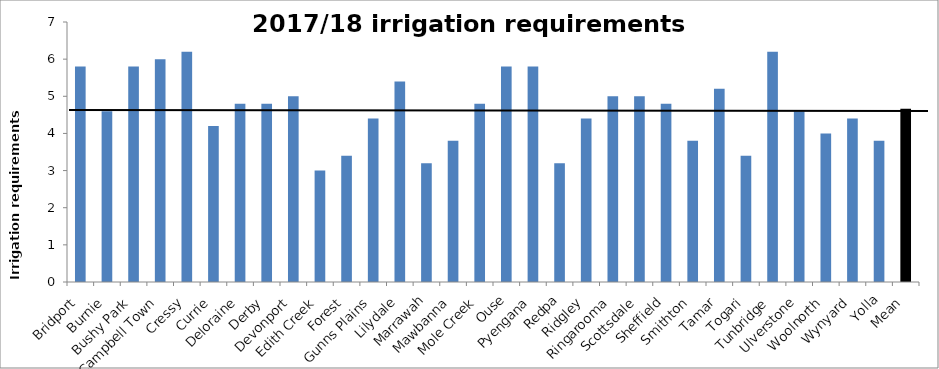
| Category | 2017/18 irrigation requirements (ML/ha) |
|---|---|
| Bridport | 5.8 |
| Burnie | 4.6 |
| Bushy Park | 5.8 |
| Campbell Town | 6 |
| Cressy | 6.2 |
| Currie | 4.2 |
| Deloraine | 4.8 |
| Derby | 4.8 |
| Devonport | 5 |
| Edith Creek | 3 |
| Forest | 3.4 |
| Gunns Plains | 4.4 |
| Lilydale | 5.4 |
| Marrawah | 3.2 |
| Mawbanna | 3.8 |
| Mole Creek | 4.8 |
| Ouse | 5.8 |
| Pyengana | 5.8 |
| Redpa | 3.2 |
| Ridgley | 4.4 |
| Ringarooma | 5 |
| Scottsdale | 5 |
| Sheffield | 4.8 |
| Smithton | 3.8 |
| Tamar | 5.2 |
| Togari | 3.4 |
| Tunbridge | 6.2 |
| Ulverstone | 4.6 |
| Woolnorth | 4 |
| Wynyard | 4.4 |
| Yolla | 3.8 |
| Mean | 4.665 |